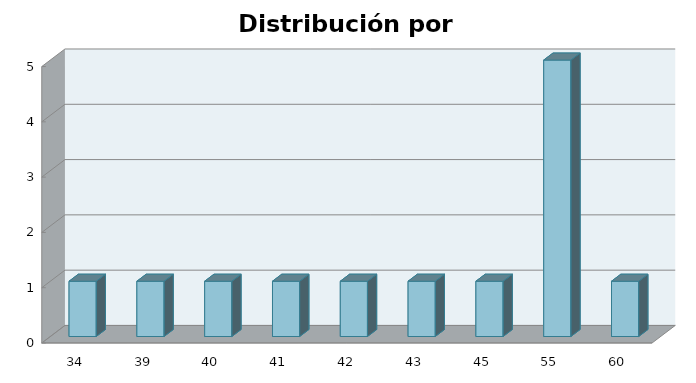
| Category | Series 1 |
|---|---|
| 34.0 | 1 |
| 39.0 | 1 |
| 40.0 | 1 |
| 41.0 | 1 |
| 42.0 | 1 |
| 43.0 | 1 |
| 45.0 | 1 |
| 55.0 | 6 |
| 60.0 | 1 |